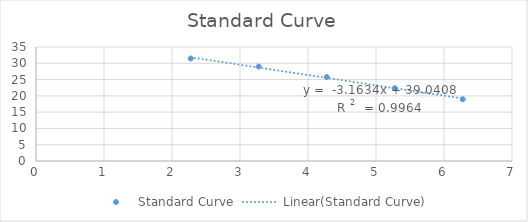
| Category | Standard Curve |
|---|---|
| 6.275167333820245 | 18.966 |
| 5.275167333820245 | 22.368 |
| 4.275167333820245 | 25.783 |
| 3.2751673338202454 | 28.999 |
| 2.2751673338202454 | 31.468 |